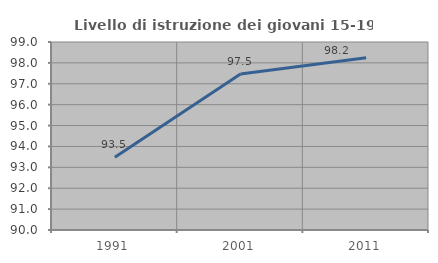
| Category | Livello di istruzione dei giovani 15-19 anni |
|---|---|
| 1991.0 | 93.481 |
| 2001.0 | 97.463 |
| 2011.0 | 98.245 |